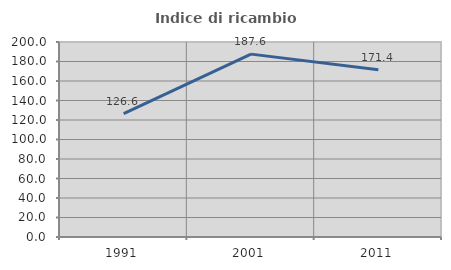
| Category | Indice di ricambio occupazionale  |
|---|---|
| 1991.0 | 126.613 |
| 2001.0 | 187.574 |
| 2011.0 | 171.429 |